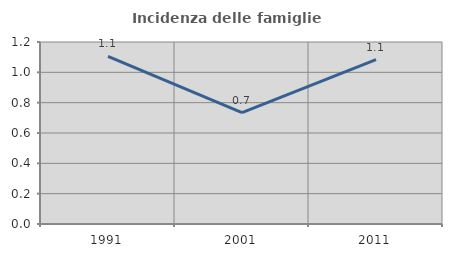
| Category | Incidenza delle famiglie numerose |
|---|---|
| 1991.0 | 1.106 |
| 2001.0 | 0.734 |
| 2011.0 | 1.084 |